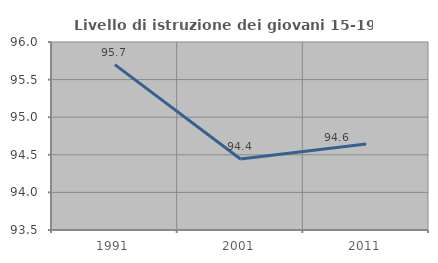
| Category | Livello di istruzione dei giovani 15-19 anni |
|---|---|
| 1991.0 | 95.699 |
| 2001.0 | 94.444 |
| 2011.0 | 94.643 |